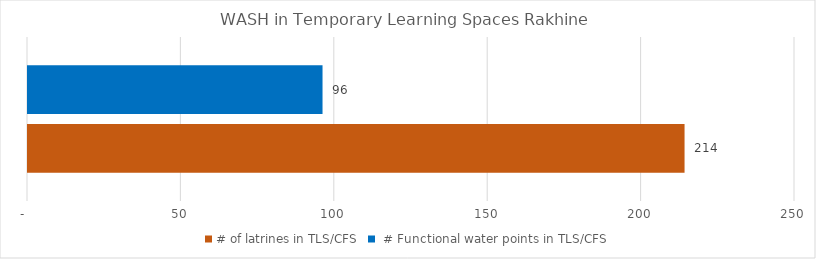
| Category | # of latrines in TLS/CFS |  # Functional water points in TLS/CFS |
|---|---|---|
| Central Rakhine | 214 | 96 |